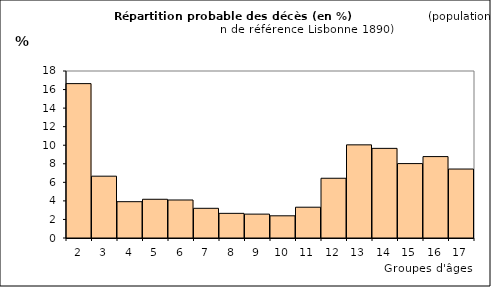
| Category | Series 0 |
|---|---|
| 2.0 | 16.64 |
| 3.0 | 6.664 |
| 4.0 | 3.915 |
| 5.0 | 4.174 |
| 6.0 | 4.097 |
| 7.0 | 3.2 |
| 8.0 | 2.656 |
| 9.0 | 2.573 |
| 10.0 | 2.392 |
| 11.0 | 3.318 |
| 12.0 | 6.439 |
| 13.0 | 10.04 |
| 14.0 | 9.661 |
| 15.0 | 8.02 |
| 16.0 | 8.776 |
| 17.0 | 7.433 |